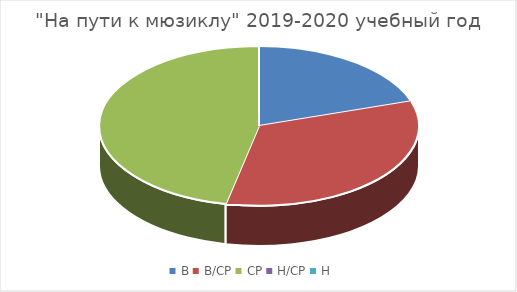
| Category | декабрь | май |
|---|---|---|
| В | 3 | 4 |
| В/СР | 5 | 8 |
| СР | 7 | 3 |
| Н/СР | 0 | 0 |
| Н | 0 | 0 |